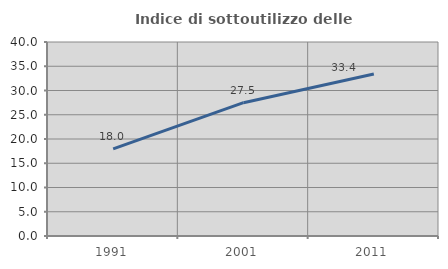
| Category | Indice di sottoutilizzo delle abitazioni  |
|---|---|
| 1991.0 | 17.976 |
| 2001.0 | 27.483 |
| 2011.0 | 33.386 |